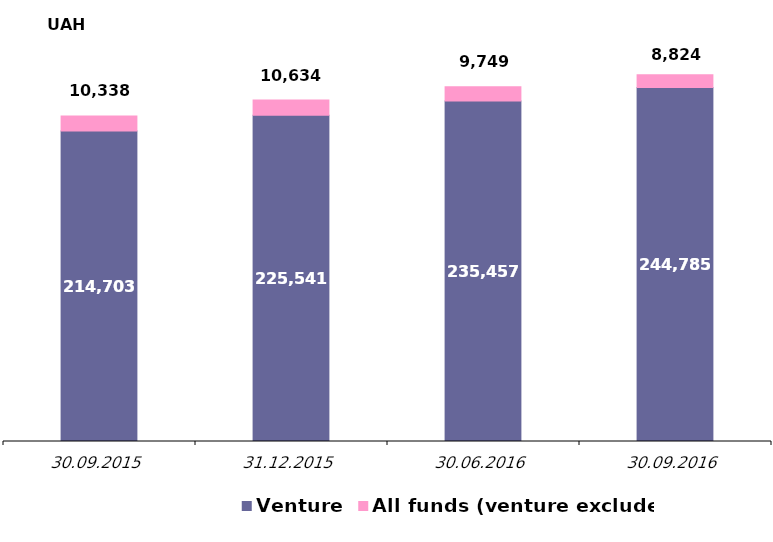
| Category | Venture  | All funds (venture excluded) |
|---|---|---|
| 30.09.2015 | 214703.027 | 10337.869 |
| 31.12.2015 | 225540.894 | 10634.107 |
| 30.06.2016 | 235457.159 | 9749.17 |
| 30.09.2016 | 244784.991 | 8823.606 |